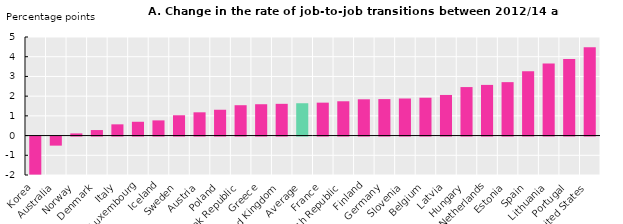
| Category | Series 0 |
|---|---|
| Korea | -1.93 |
| Australia | -0.46 |
| Norway | 0.11 |
| Denmark | 0.28 |
| Italy | 0.57 |
| Luxembourg | 0.7 |
| Iceland | 0.77 |
| Sweden | 1.03 |
| Austria | 1.18 |
| Poland | 1.31 |
| Slovak Republic | 1.54 |
| Greece | 1.59 |
| United Kingdom | 1.61 |
| Average | 1.64 |
| France | 1.67 |
| Czech Republic | 1.74 |
| Finland | 1.84 |
| Germany | 1.85 |
| Slovenia | 1.88 |
| Belgium | 1.92 |
| Latvia | 2.06 |
| Hungary | 2.46 |
| Netherlands | 2.57 |
| Estonia | 2.71 |
| Spain | 3.26 |
| Lithuania | 3.65 |
| Portugal | 3.89 |
| United States | 4.48 |